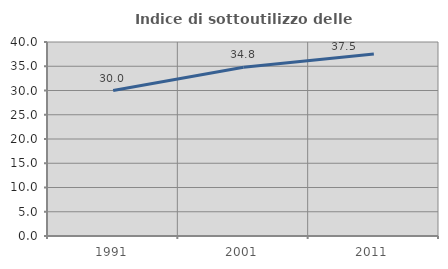
| Category | Indice di sottoutilizzo delle abitazioni  |
|---|---|
| 1991.0 | 30 |
| 2001.0 | 34.799 |
| 2011.0 | 37.529 |